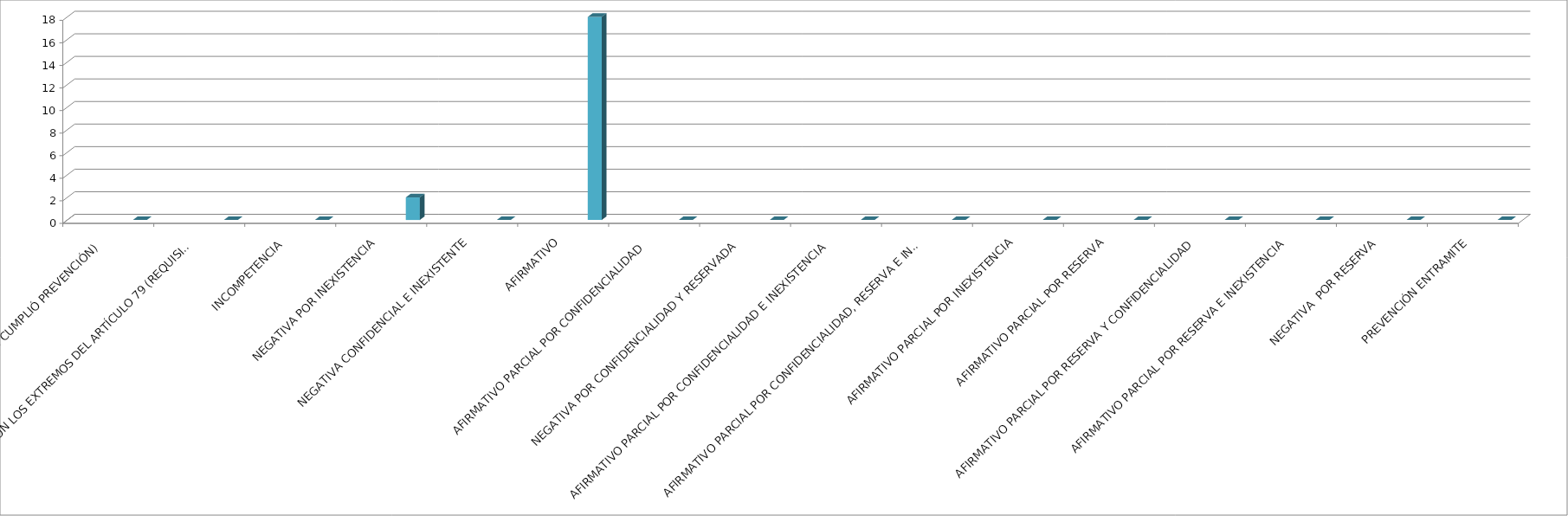
| Category | Series 0 | Series 1 | Series 2 | Series 3 | Series 4 |
|---|---|---|---|---|---|
| SE TIENE POR NO PRESENTADA ( NO CUMPLIÓ PREVENCIÓN) |  |  |  |  | 0 |
| NO CUMPLIO CON LOS EXTREMOS DEL ARTÍCULO 79 (REQUISITOS) |  |  |  |  | 0 |
| INCOMPETENCIA  |  |  |  |  | 0 |
| NEGATIVA POR INEXISTENCIA |  |  |  |  | 2 |
| NEGATIVA CONFIDENCIAL E INEXISTENTE |  |  |  |  | 0 |
| AFIRMATIVO |  |  |  |  | 18 |
| AFIRMATIVO PARCIAL POR CONFIDENCIALIDAD  |  |  |  |  | 0 |
| NEGATIVA POR CONFIDENCIALIDAD Y RESERVADA |  |  |  |  | 0 |
| AFIRMATIVO PARCIAL POR CONFIDENCIALIDAD E INEXISTENCIA |  |  |  |  | 0 |
| AFIRMATIVO PARCIAL POR CONFIDENCIALIDAD, RESERVA E INEXISTENCIA |  |  |  |  | 0 |
| AFIRMATIVO PARCIAL POR INEXISTENCIA |  |  |  |  | 0 |
| AFIRMATIVO PARCIAL POR RESERVA |  |  |  |  | 0 |
| AFIRMATIVO PARCIAL POR RESERVA Y CONFIDENCIALIDAD |  |  |  |  | 0 |
| AFIRMATIVO PARCIAL POR RESERVA E INEXISTENCIA |  |  |  |  | 0 |
| NEGATIVA  POR RESERVA |  |  |  |  | 0 |
| PREVENCIÓN ENTRAMITE |  |  |  |  | 0 |